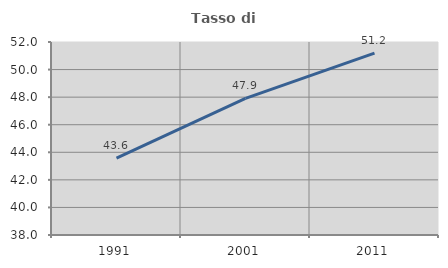
| Category | Tasso di occupazione   |
|---|---|
| 1991.0 | 43.578 |
| 2001.0 | 47.905 |
| 2011.0 | 51.194 |